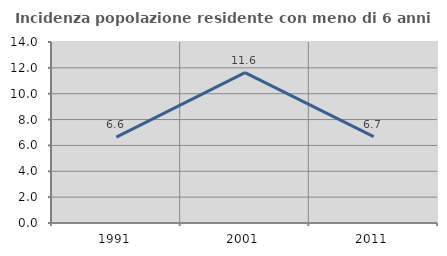
| Category | Incidenza popolazione residente con meno di 6 anni |
|---|---|
| 1991.0 | 6.647 |
| 2001.0 | 11.634 |
| 2011.0 | 6.686 |